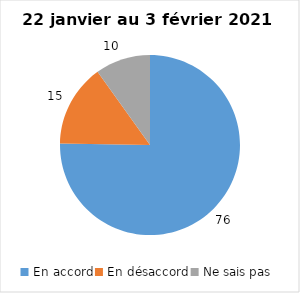
| Category | Series 0 |
|---|---|
| En accord | 76 |
| En désaccord | 15 |
| Ne sais pas | 10 |